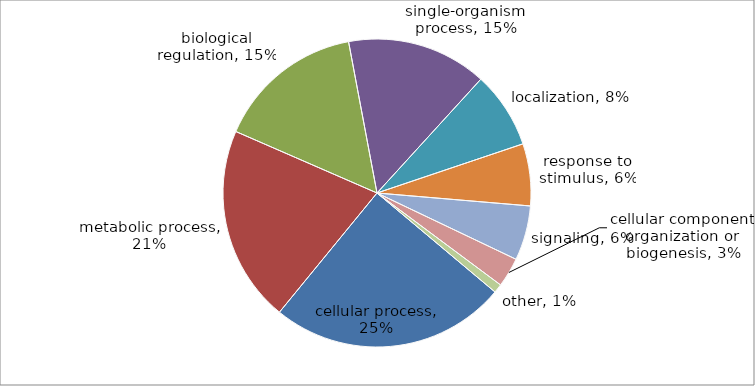
| Category | Series 0 |
|---|---|
| cellular process | 160 |
| metabolic process | 133 |
| biological regulation | 100 |
| single-organism process | 95 |
| localization | 52 |
| response to stimulus | 42 |
| signaling | 37 |
| cellular component organization or biogenesis | 20 |
| other | 6 |